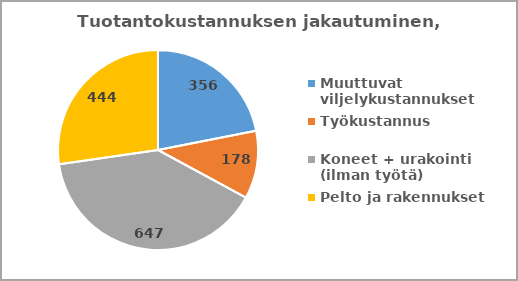
| Category | Series 0 |
|---|---|
| Muuttuvat viljelykustannukset | 356.438 |
| Työkustannus | 178.42 |
| Koneet + urakointi (ilman työtä) | 647.41 |
| Pelto ja rakennukset | 443.806 |